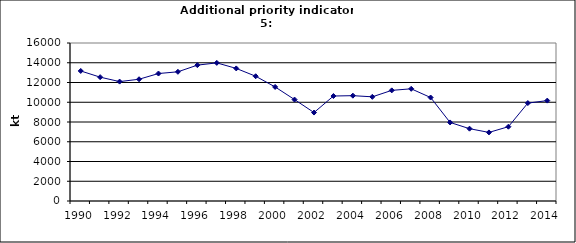
| Category | Production of oxygen steel, kt |
|---|---|
| 1990 | 13169 |
| 1991 | 12540 |
| 1992 | 12091 |
| 1993 | 12330 |
| 1994 | 12909 |
| 1995 | 13083 |
| 1996 | 13759 |
| 1997 | 13987 |
| 1998 | 13426 |
| 1999 | 12633 |
| 2000 | 11551 |
| 2001 | 10271 |
| 2002 | 8956 |
| 2003 | 10630 |
| 2004 | 10667 |
| 2005 | 10549.7 |
| 2006 | 11202.6 |
| 2007 | 11361.9 |
| 2008 | 10478 |
| 2009 | 7955 |
| 2010 | 7322.9 |
| 2011 | 6946.2 |
| 2012 | 7525.1 |
| 2013 | 9915.1 |
| 2014 | 10165 |